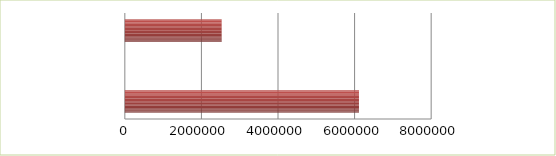
| Category | Series 0 | Series 1 |
|---|---|---|
| 0 | 2.5 | 6114400 |
| 1 | 2.6 | 0 |
| 2 | 2.7 | 2528400 |